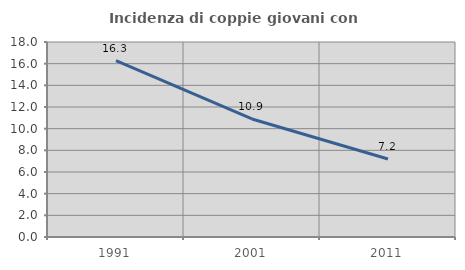
| Category | Incidenza di coppie giovani con figli |
|---|---|
| 1991.0 | 16.285 |
| 2001.0 | 10.896 |
| 2011.0 | 7.199 |